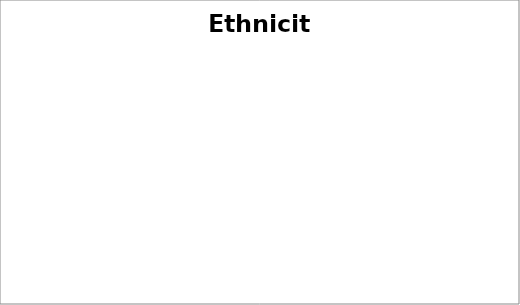
| Category | Series 0 |
|---|---|
| British | 0 |
| Irish | 0 |
| Other White Background | 0 |
| White & Black Caribbean | 0 |
| White and Black African | 0 |
| White and Asian | 0 |
| Other Mixed Background | 0 |
| Indian | 0 |
| Pakistani | 0 |
| Bangladeshi | 0 |
| Other Asian Background | 0 |
| Caribbean | 0 |
| African | 0 |
| Other Black background | 0 |
| Chinese | 0 |
| Other ethnic group | 0 |
| Prefer not to say | 0 |
| Don't Know | 0 |